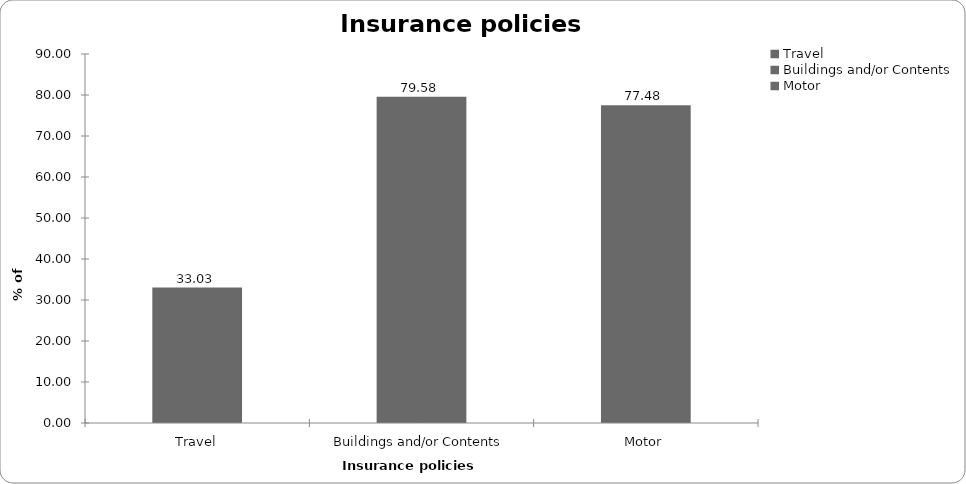
| Category | Insurance policies held |
|---|---|
| Travel | 33.033 |
| Buildings and/or Contents | 79.58 |
| Motor | 77.477 |